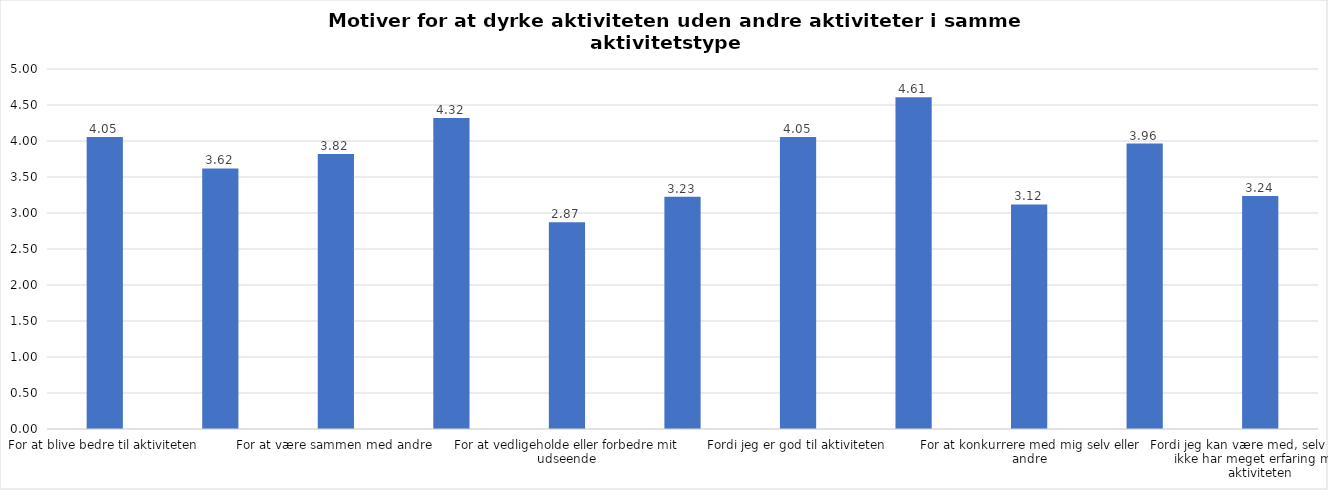
| Category | Gennemsnit |
|---|---|
| For at blive bedre til aktiviteten | 4.055 |
| For at vedligeholde eller forbedre min sundhed (fx helbred, fysisk form) | 3.618 |
| For at være sammen med andre | 3.818 |
| For at gøre noget godt for mig selv | 4.318 |
| For at vedligeholde eller forbedre mit udseende | 2.873 |
| Fordi andre i min omgangskreds opmuntrer mig til det | 3.227 |
| Fordi jeg er god til aktiviteten | 4.055 |
| Fordi jeg godt kan lide aktiviteten | 4.609 |
| For at konkurrere med mig selv eller andre | 3.118 |
| Fordi aktiviteten passer godt ind i min hverdag | 3.964 |
| Fordi jeg kan være med, selv om jeg ikke har meget erfaring med aktiviteten | 3.236 |